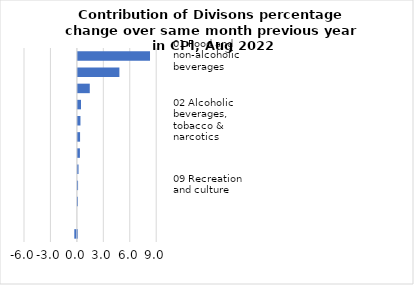
| Category |     Contributions |
|---|---|
| 01 Food and non-alcoholic beverages | 8.185 |
| 07 Transport | 4.711 |
| 04 Housing, water, electricity, gas & other fuels | 1.351 |
| 12 Miscellaneous goods & services | 0.354 |
| 02 Alcoholic beverages, tobacco & narcotics | 0.292 |
| 05 Furnishings, household equipment & maintenance | 0.249 |
| 06 Health | 0.231 |
| 11 Restaurants and hotels | 0.074 |
| 09 Recreation and culture | 0.022 |
| 03 Clothing and footwear | 0.007 |
| 08 Communication | 0 |
| 10 Education | -0.292 |